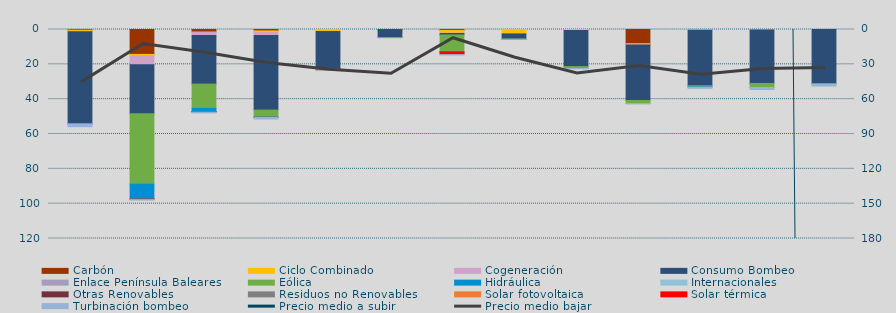
| Category | Carbón | Ciclo Combinado | Cogeneración | Consumo Bombeo | Enlace Península Baleares | Eólica | Hidráulica | Internacionales | Otras Renovables | Residuos no Renovables | Solar fotovoltaica | Solar térmica | Turbinación bombeo |
|---|---|---|---|---|---|---|---|---|---|---|---|---|---|
| 0 | 376.2 | 910.9 | 0 | 52921.9 | 0 | 42.8 | 0 |  | 0 | 0 | 0 | 0 | 1542.2 |
| 1 | 14289.6 | 859.1 | 5068.8 | 28184.1 | 0 | 40432 | 8486.1 |  | 49.4 | 334.8 | 0 | 0 | 110.8 |
| 2 | 1420.9 | 0 | 2008.3 | 27920 | 0 | 13960.1 | 1762.8 |  | 22.7 | 98.3 | 0 | 224.2 | 474.7 |
| 3 | 808.2 | 1016.6 | 1618.6 | 42815.3 | 0 | 4070.8 | 105.9 |  | 51.2 | 12.8 | 0 | 0 | 879 |
| 4 | 0 | 1097.9 | 0 | 21404.4 | 0 | 137.4 | 0 |  | 0 | 0 | 0 | 518.8 | 108.8 |
| 5 | 294.2 | 0 | 0 | 4310.8 | 42.4 | 0.6 | 0 |  | 0 | 0 | 0 | 0 | 0 |
| 6 | 516.7 | 1537.9 | 257 | 809.6 | 0 | 9502.9 | 408.7 |  | 117.5 | 0 | 0.4 | 1254.7 | 102.9 |
| 7 | 0 | 2533.1 | 0 | 2991.4 | 0 | 42.6 | 0 |  | 0 | 0 | 0 | 0 | 65 |
| 8 | 0 | 555.8 | 0 | 20748.5 | 0 | 1071 | 8.2 |  | 0 | 0 | 0 | 0 | 183.2 |
| 9 | 8149.5 | 754.8 | 3.5 | 31856.3 | 0 | 1760.6 | 0 |  | 0 | 0 | 0 | 0 | 177.8 |
| 10 | 0 | 458.3 | 0 | 31829.7 | 0 | 671.7 | 189.5 |  | 0 | 0 | 0 | 0 | 613.5 |
| 11 | 0 | 223.8 | 2.4 | 30752.2 | 0 | 2324.3 | 0 |  | 0 | 0 | 0 | 0 | 1135.9 |
| 12 | 0 | 0 | 0 | 31097.5 | 0 | 268.5 | 0 |  | 0 | 0 | 0 | 0 | 1121.8 |